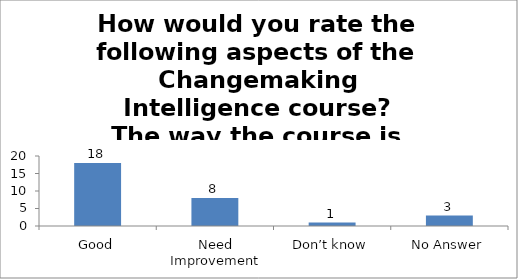
| Category | How would you rate the following aspects of the Changemaking Intelligence course?
The way the course is carried out. |
|---|---|
| Good | 18 |
| Need Improvement | 8 |
| Don’t know | 1 |
| No Answer | 3 |